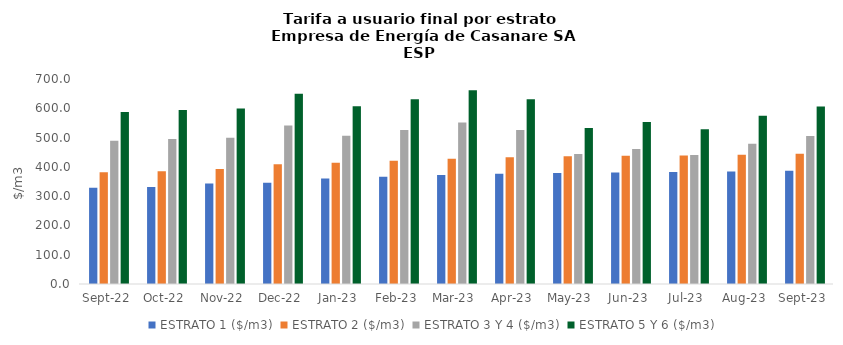
| Category | ESTRATO 1 ($/m3) | ESTRATO 2 ($/m3) | ESTRATO 3 Y 4 ($/m3) | ESTRATO 5 Y 6 ($/m3) |
|---|---|---|---|---|
| 2022-09-01 | 328.41 | 381.87 | 489.35 | 587.22 |
| 2022-10-01 | 331.46 | 385.42 | 495.2 | 594.24 |
| 2022-11-01 | 342.8 | 393 | 499.63 | 599.556 |
| 2022-12-01 | 345.44 | 408.5 | 541.57 | 649.884 |
| 2023-01-01 | 359.93 | 413.65 | 505.984 | 607.18 |
| 2023-02-01 | 366.33 | 421 | 525.703 | 630.843 |
| 2023-03-01 | 372.41 | 428 | 551.417 | 661.7 |
| 2023-04-01 | 376.32 | 432.49 | 525.703 | 630.843 |
| 2023-05-01 | 379.26 | 435.87 | 444.034 | 532.841 |
| 2023-06-01 | 380.92 | 437.78 | 460.92 | 553.104 |
| 2023-07-01 | 382.06 | 439.09 | 440.108 | 528.13 |
| 2023-08-01 | 383.97 | 441.29 | 479.093 | 574.912 |
| 2023-09-01 | 386.66 | 444.37 | 505.302 | 606.362 |